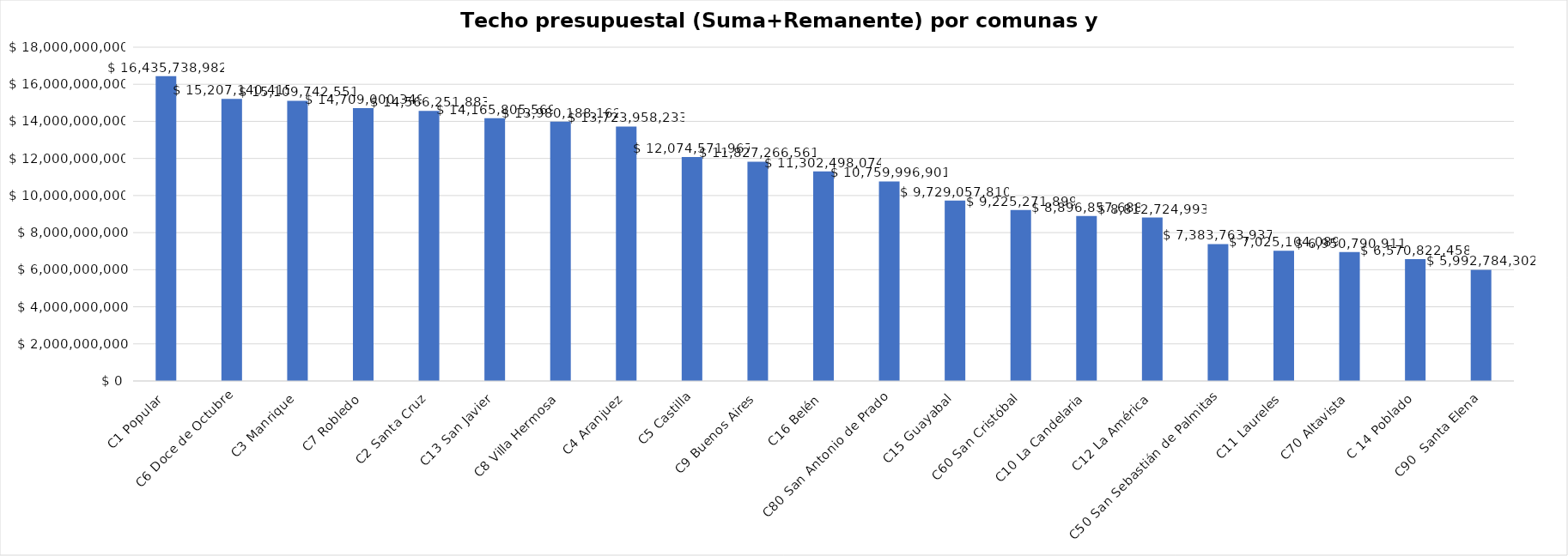
| Category | Series 0 |
|---|---|
| C1 Popular | 16435738982 |
| C6 Doce de Octubre | 15207140415 |
| C3 Manrique | 15109742551 |
| C7 Robledo | 14709000349 |
| C2 Santa Cruz | 14566251883 |
| C13 San Javier | 14165805569 |
| C8 Villa Hermosa | 13980188162 |
| C4 Aranjuez | 13723958233 |
| C5 Castilla | 12074571967 |
| C9 Buenos Aires | 11827266561 |
| C16 Belén | 11302498074 |
| C80 San Antonio de Prado | 10759996901 |
| C15 Guayabal | 9729057810 |
| C60 San Cristóbal | 9225271899 |
| C10 La Candelaria | 8896857688 |
| C12 La América | 8812724993 |
| C50 San Sebastián de Palmitas  | 7383763937 |
| C11 Laureles | 7025104089 |
| C70 Altavista | 6950790911 |
| C 14 Poblado | 6570822458 |
| C90  Santa Elena | 5992784302 |